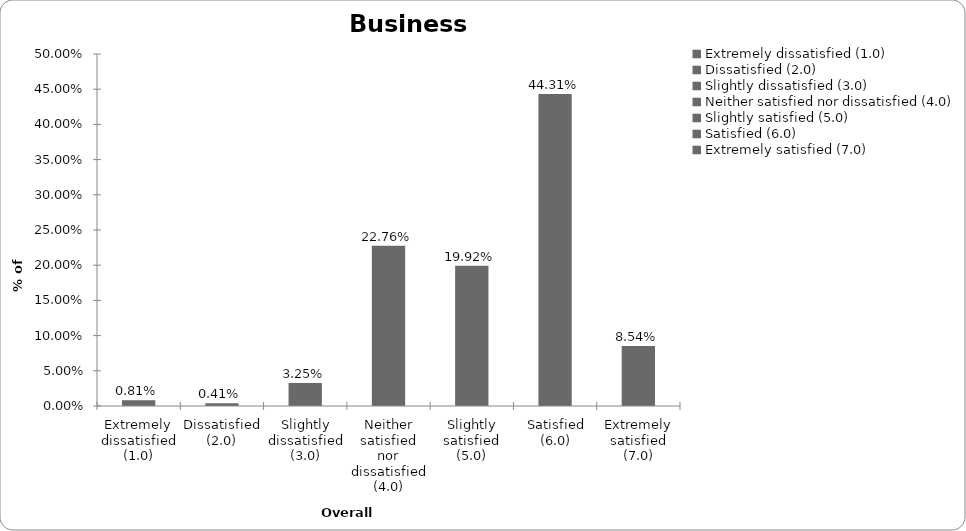
| Category | Business Interruption |
|---|---|
| Extremely dissatisfied (1.0) | 0.008 |
| Dissatisfied (2.0) | 0.004 |
| Slightly dissatisfied (3.0) | 0.033 |
| Neither satisfied nor dissatisfied (4.0) | 0.228 |
| Slightly satisfied (5.0) | 0.199 |
| Satisfied (6.0) | 0.443 |
| Extremely satisfied (7.0) | 0.085 |